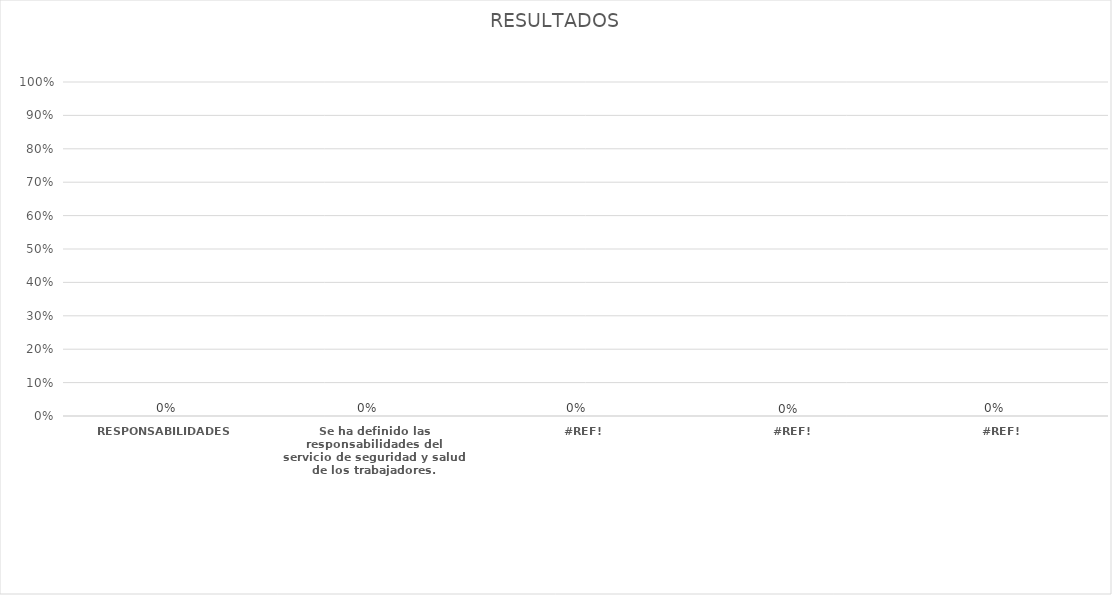
| Category | Series 0 |
|---|---|
| RESPONSABILIDADES | 0 |
| Se ha definido las responsabilidades del servicio de seguridad y salud de los trabajadores. | 0 |
| #¡REF! | 0 |
| #¡REF! | 0 |
| #¡REF! | 0 |